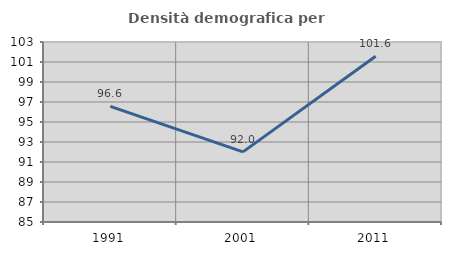
| Category | Densità demografica |
|---|---|
| 1991.0 | 96.567 |
| 2001.0 | 92.012 |
| 2011.0 | 101.577 |